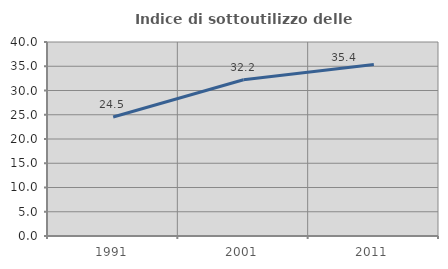
| Category | Indice di sottoutilizzo delle abitazioni  |
|---|---|
| 1991.0 | 24.53 |
| 2001.0 | 32.228 |
| 2011.0 | 35.358 |